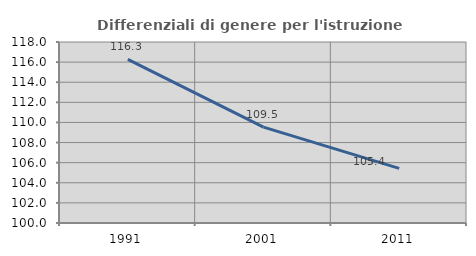
| Category | Differenziali di genere per l'istruzione superiore |
|---|---|
| 1991.0 | 116.266 |
| 2001.0 | 109.538 |
| 2011.0 | 105.433 |